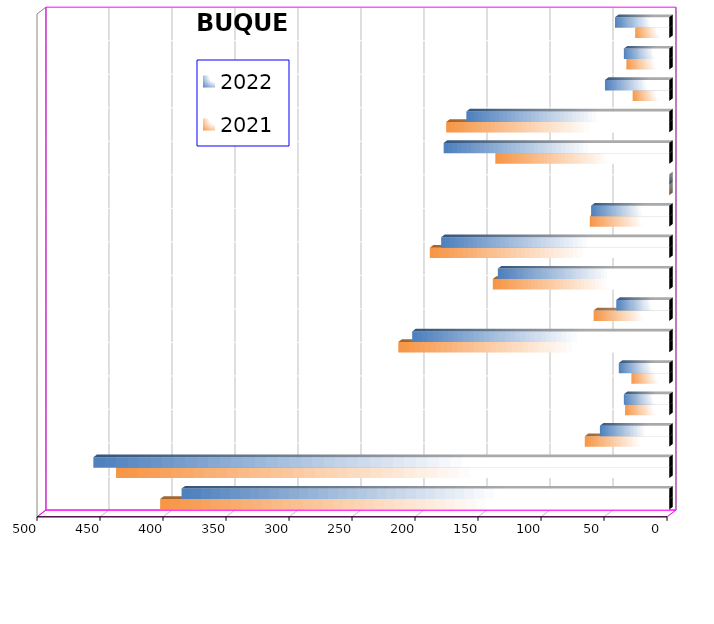
| Category | 2021 | 2022 |
|---|---|---|
| ICAVE | 404 | 387 |
| CICE | 439 | 457 |
| T. C. E. | 67 | 55 |
| CARGILL | 35 | 36 |
| TMV | 30 | 40 |
| SSA | 215 | 204 |
| SEPSA | 60 | 42 |
| VOPAK | 140 | 136 |
| CPV | 190 | 181 |
| EXCELLENCE | 63 | 62 |
| APASCO | 0 | 0 |
| SIPPB | 138 | 179 |
| PEMEX | 177 | 161 |
| PETRA | 29 | 51 |
| OPEVER | 34 | 36 |
| ESJ Renovable III | 27 | 43 |